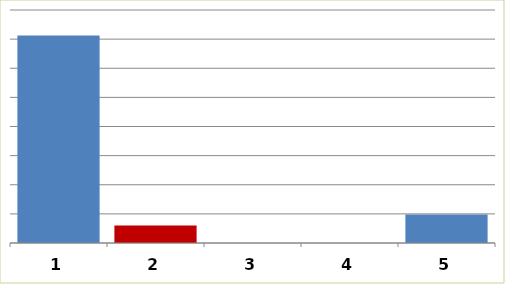
| Category | Series 0 |
|---|---|
| 0 | 3562000 |
| 1 | 300000 |
| 2 | 0 |
| 3 | 0 |
| 4 | 490000 |